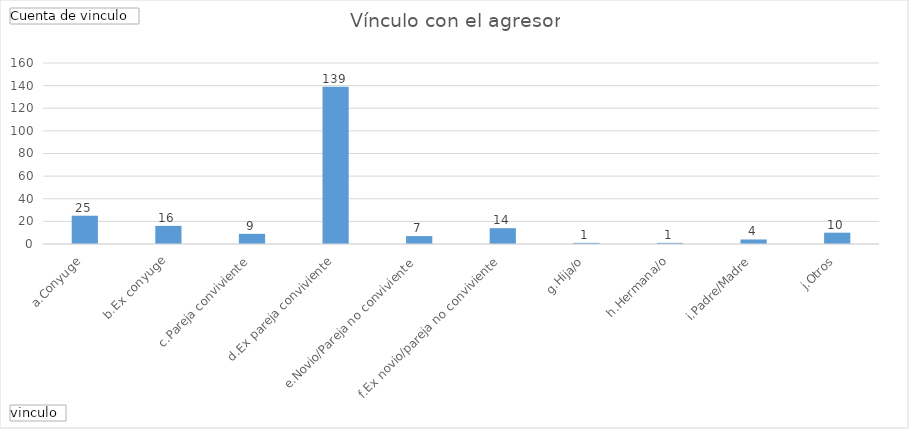
| Category | Total |
|---|---|
| a.Conyuge | 25 |
| b.Ex conyuge | 16 |
| c.Pareja conviviente | 9 |
| d.Ex pareja conviviente | 139 |
| e.Novio/Pareja no conviviente | 7 |
| f.Ex novio/pareja no conviviente | 14 |
| g.Hija/o | 1 |
| h.Hermana/o | 1 |
| i.Padre/Madre | 4 |
| j.Otros | 10 |